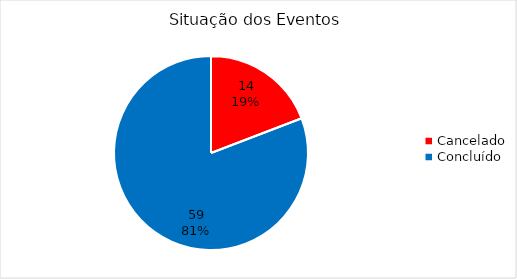
| Category | Total |
|---|---|
| Cancelado | 14 |
| Concluído | 59 |